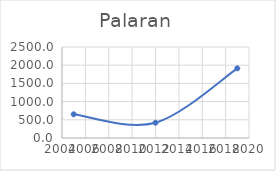
| Category | Series 0 |
|---|---|
| 2005.0 | 650.865 |
| 2012.0 | 419.136 |
| 2019.0 | 1913.652 |